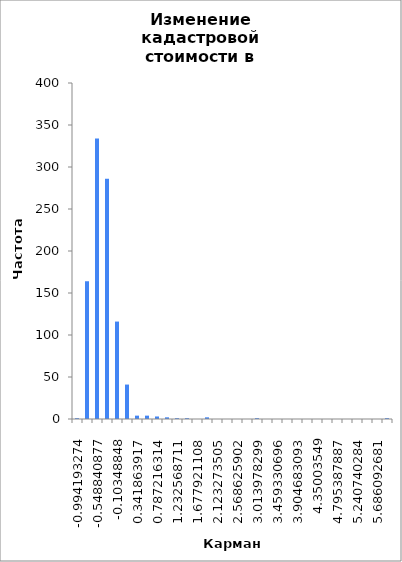
| Category | Частота |
|---|---|
| -99% | 1 |
| -77% | 164 |
| -55% | 334 |
| -33% | 286 |
| -10% | 116 |
| 12% | 41 |
| 34% | 4 |
| 56% | 4 |
| 79% | 3 |
| 101% | 2 |
| 123% | 1 |
| 146% | 1 |
| 168% | 0 |
| 190% | 2 |
| 212% | 0 |
| 235% | 0 |
| 257% | 0 |
| 279% | 0 |
| 301% | 1 |
| 324% | 0 |
| 346% | 0 |
| 368% | 0 |
| 390% | 0 |
| 413% | 0 |
| 435% | 0 |
| 457% | 0 |
| 480% | 0 |
| 502% | 0 |
| 524% | 0 |
| 546% | 0 |
| 569% | 0 |
| Еще | 1 |